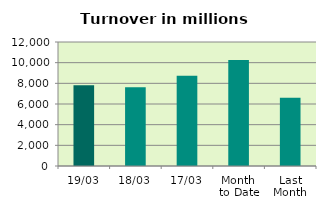
| Category | Series 0 |
|---|---|
| 19/03 | 7818.194 |
| 18/03 | 7623.03 |
| 17/03 | 8734.146 |
| Month 
to Date | 10261.071 |
| Last
Month | 6605.047 |